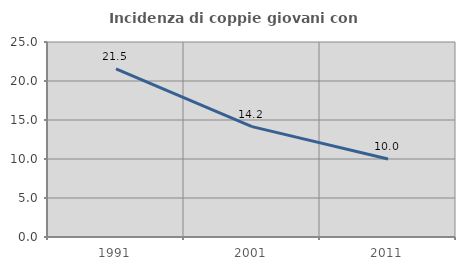
| Category | Incidenza di coppie giovani con figli |
|---|---|
| 1991.0 | 21.547 |
| 2001.0 | 14.152 |
| 2011.0 | 10 |